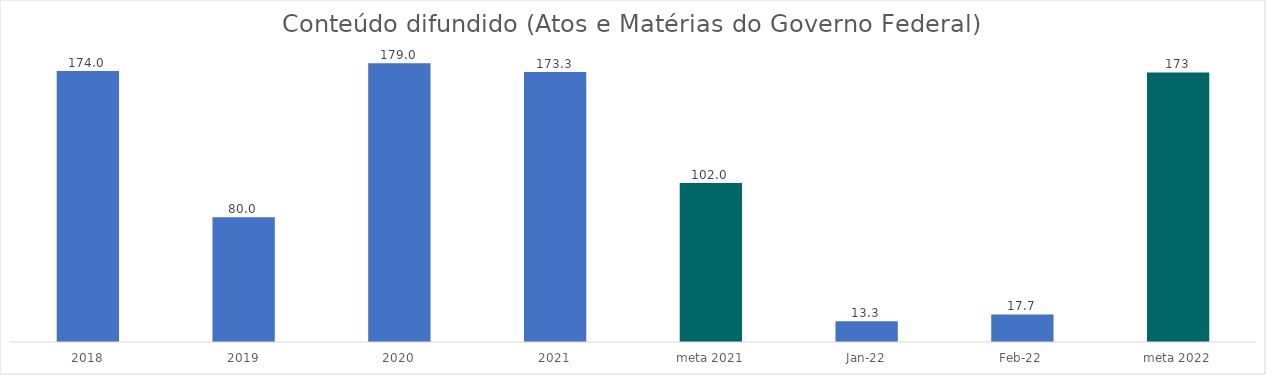
| Category | Series 0 |
|---|---|
| 2018 | 174 |
| 2019 | 80 |
| 2020 | 179 |
| 2021 | 173.3 |
| meta 2021 | 102 |
| jan/22 | 13.3 |
| fev/22 | 17.7 |
| meta 2022 | 173 |